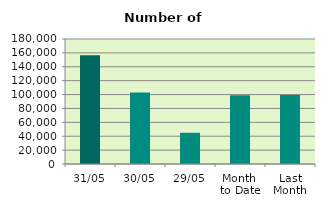
| Category | Series 0 |
|---|---|
| 31/05 | 156558 |
| 30/05 | 102788 |
| 29/05 | 44972 |
| Month 
to Date | 98885.545 |
| Last
Month | 99222.444 |